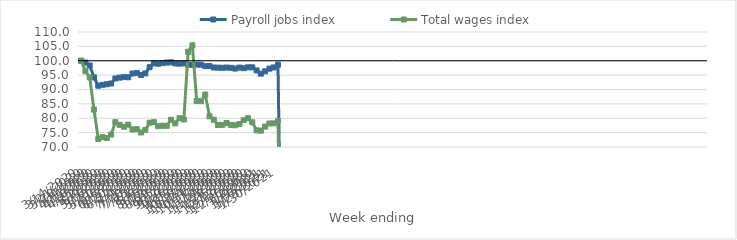
| Category | Payroll jobs index | Total wages index |
|---|---|---|
| 14/03/2020 | 100 | 100 |
| 21/03/2020 | 99.377 | 96.378 |
| 28/03/2020 | 98.355 | 94.229 |
| 04/04/2020 | 94.206 | 83.003 |
| 11/04/2020 | 91.32 | 72.784 |
| 18/04/2020 | 91.64 | 73.411 |
| 25/04/2020 | 91.833 | 73.135 |
| 02/05/2020 | 92.085 | 74.318 |
| 09/05/2020 | 93.832 | 78.649 |
| 16/05/2020 | 94.124 | 77.714 |
| 23/05/2020 | 94.324 | 77.026 |
| 30/05/2020 | 94.256 | 77.785 |
| 06/06/2020 | 95.555 | 76.088 |
| 13/06/2020 | 95.716 | 76.211 |
| 20/06/2020 | 95.054 | 75.052 |
| 27/06/2020 | 95.587 | 75.972 |
| 04/07/2020 | 97.76 | 78.443 |
| 11/07/2020 | 99.106 | 78.632 |
| 18/07/2020 | 98.965 | 77.23 |
| 25/07/2020 | 99.178 | 77.407 |
| 01/08/2020 | 99.369 | 77.349 |
| 08/08/2020 | 99.447 | 79.482 |
| 15/08/2020 | 99.058 | 78.21 |
| 22/08/2020 | 98.997 | 80.023 |
| 29/08/2020 | 99.078 | 79.561 |
| 05/09/2020 | 98.639 | 103.129 |
| 12/09/2020 | 98.6 | 105.35 |
| 19/09/2020 | 98.676 | 86 |
| 26/09/2020 | 98.624 | 85.939 |
| 03/10/2020 | 98.115 | 88.226 |
| 10/10/2020 | 98.146 | 80.684 |
| 17/10/2020 | 97.644 | 79.484 |
| 24/10/2020 | 97.602 | 77.641 |
| 31/10/2020 | 97.547 | 77.702 |
| 07/11/2020 | 97.635 | 78.347 |
| 14/11/2020 | 97.529 | 77.699 |
| 21/11/2020 | 97.281 | 77.572 |
| 28/11/2020 | 97.614 | 78.01 |
| 05/12/2020 | 97.417 | 79.329 |
| 12/12/2020 | 97.71 | 80.022 |
| 19/12/2020 | 97.715 | 78.591 |
| 26/12/2020 | 96.633 | 75.817 |
| 02/01/2021 | 95.502 | 75.67 |
| 09/01/2021 | 96.325 | 77.104 |
| 16/01/2021 | 97.261 | 78.184 |
| 23/01/2021 | 97.67 | 78.23 |
| 30/01/2021 | 98.65 | 78.984 |